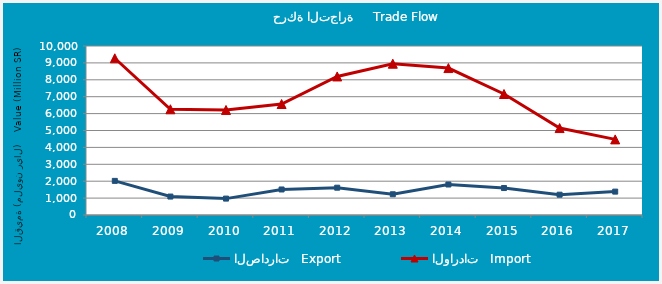
| Category | الصادرات   Export | الواردات   Import |
|---|---|---|
| 2008.0 | 2018422820 | 9274196794 |
| 2009.0 | 1091219009 | 6256318863 |
| 2010.0 | 969893715 | 6215643520 |
| 2011.0 | 1509944865 | 6567281579 |
| 2012.0 | 1615620568 | 8198654597 |
| 2013.0 | 1227110284 | 8952255912 |
| 2014.0 | 1804432803 | 8694140592 |
| 2015.0 | 1595231805 | 7158951645 |
| 2016.0 | 1201677739 | 5144170015 |
| 2017.0 | 1383757715 | 4473881423 |